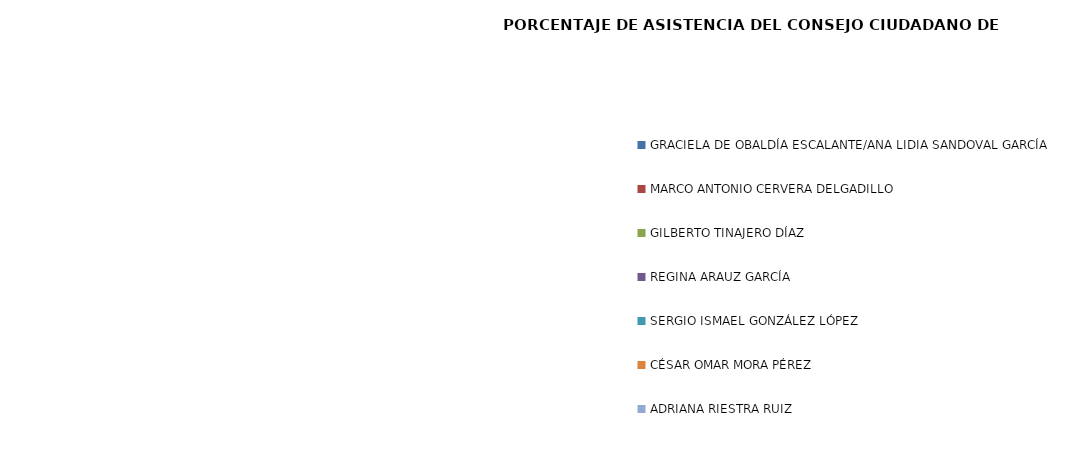
| Category | Series 0 |
|---|---|
| GRACIELA DE OBALDÍA ESCALANTE/ANA LIDIA SANDOVAL GARCÍA | 0 |
| MARCO ANTONIO CERVERA DELGADILLO | 0 |
| GILBERTO TINAJERO DÍAZ | 0 |
| REGINA ARAUZ GARCÍA | 0 |
| SERGIO ISMAEL GONZÁLEZ LÓPEZ | 0 |
| CÉSAR OMAR MORA PÉREZ | 0 |
| ADRIANA RIESTRA RUIZ | 0 |